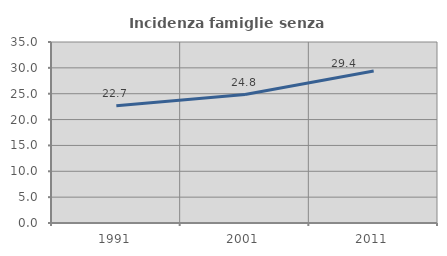
| Category | Incidenza famiglie senza nuclei |
|---|---|
| 1991.0 | 22.675 |
| 2001.0 | 24.838 |
| 2011.0 | 29.395 |